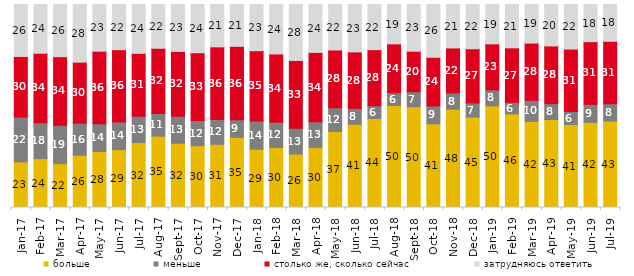
| Category | больше | меньше | столько же, сколько сейчас | затрудняюсь ответить |
|---|---|---|---|---|
| 2017-01-01 | 22.5 | 22.05 | 29.85 | 25.6 |
| 2017-02-01 | 24.05 | 17.7 | 34.2 | 24 |
| 2017-03-01 | 21.6 | 18.9 | 33.8 | 25.7 |
| 2017-04-01 | 25.75 | 15.8 | 30.05 | 28.4 |
| 2017-05-01 | 27.6 | 13.7 | 35.7 | 23 |
| 2017-06-01 | 28.5 | 13.65 | 35.6 | 22.25 |
| 2017-07-01 | 32 | 13 | 30.95 | 24.05 |
| 2017-08-01 | 35.15 | 11.2 | 32.1 | 21.55 |
| 2017-09-01 | 31.65 | 13.3 | 31.95 | 23.1 |
| 2017-10-01 | 30.4 | 12.45 | 33.35 | 23.75 |
| 2017-11-01 | 31.15 | 12.15 | 35.85 | 20.85 |
| 2017-12-01 | 34.55 | 8.7 | 36.15 | 20.6 |
| 2018-01-01 | 28.7 | 13.9 | 34.65 | 22.75 |
| 2018-02-01 | 29.55 | 12.4 | 33.7 | 24.35 |
| 2018-03-01 | 26.35 | 12.75 | 33.35 | 27.55 |
| 2018-04-01 | 29.6 | 12.7 | 34.1 | 23.6 |
| 2018-05-01 | 37.45 | 11.7 | 28.45 | 22.4 |
| 2018-06-01 | 41 | 7.8 | 27.85 | 23.35 |
| 2018-07-01 | 43.9 | 6.25 | 27.6 | 22.25 |
| 2018-08-01 | 50.25 | 6.35 | 24 | 19.4 |
| 2018-09-01 | 49.65 | 7.35 | 19.95 | 23 |
| 2018-10-01 | 41.2 | 8.85 | 23.95 | 26 |
| 2018-11-01 | 48.403 | 8.034 | 22.156 | 21.407 |
| 2018-12-01 | 44.55 | 6.95 | 26.7 | 21.8 |
| 2019-01-01 | 50.1 | 7.85 | 22.65 | 19.4 |
| 2019-02-01 | 46.15 | 5.6 | 26.9 | 21.35 |
| 2019-03-01 | 42.417 | 10.343 | 28.245 | 18.996 |
| 2019-04-01 | 43.317 | 7.871 | 28.416 | 20.396 |
| 2019-05-01 | 40.862 | 6.439 | 30.758 | 21.942 |
| 2019-06-01 | 41.945 | 8.878 | 30.873 | 18.304 |
| 2019-07-01 | 42.624 | 8.465 | 30.792 | 18.119 |